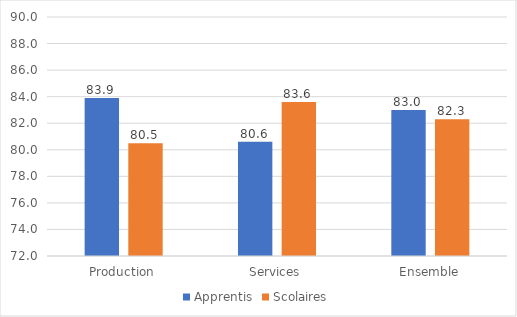
| Category | Apprentis | Scolaires |
|---|---|---|
| Production | 83.9 | 80.5 |
| Services | 80.6 | 83.6 |
| Ensemble | 83 | 82.3 |